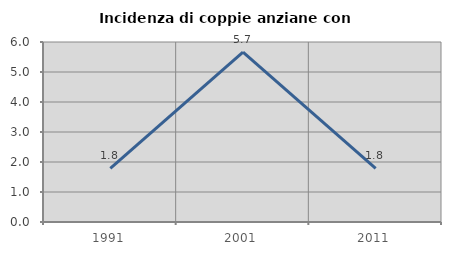
| Category | Incidenza di coppie anziane con figli |
|---|---|
| 1991.0 | 1.786 |
| 2001.0 | 5.66 |
| 2011.0 | 1.786 |